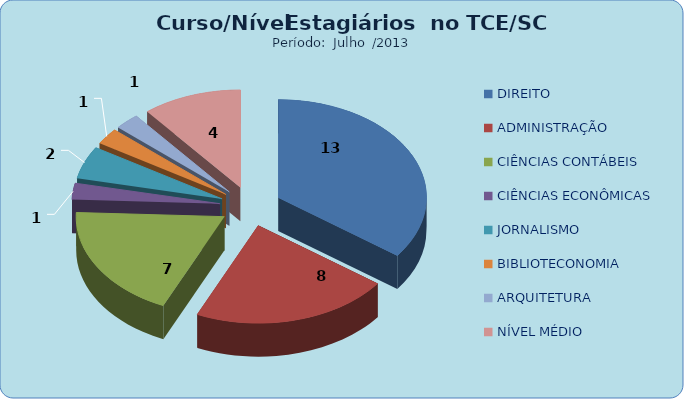
| Category | Series 0 |
|---|---|
| DIREITO | 13 |
| ADMINISTRAÇÃO | 8 |
| CIÊNCIAS CONTÁBEIS | 7 |
| CIÊNCIAS ECONÔMICAS | 1 |
| JORNALISMO | 2 |
| BIBLIOTECONOMIA | 1 |
| ARQUITETURA | 1 |
| NÍVEL MÉDIO | 4 |